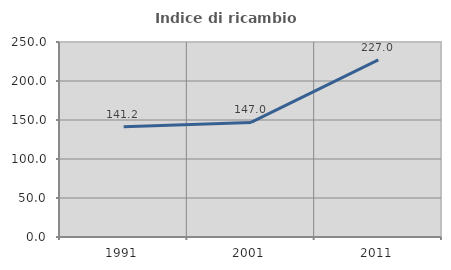
| Category | Indice di ricambio occupazionale  |
|---|---|
| 1991.0 | 141.218 |
| 2001.0 | 146.953 |
| 2011.0 | 226.978 |